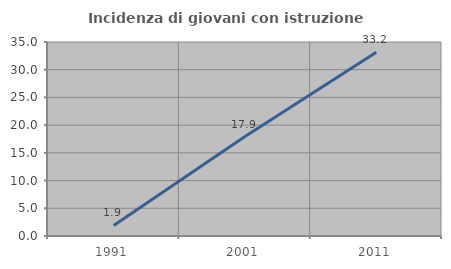
| Category | Incidenza di giovani con istruzione universitaria |
|---|---|
| 1991.0 | 1.914 |
| 2001.0 | 17.935 |
| 2011.0 | 33.158 |